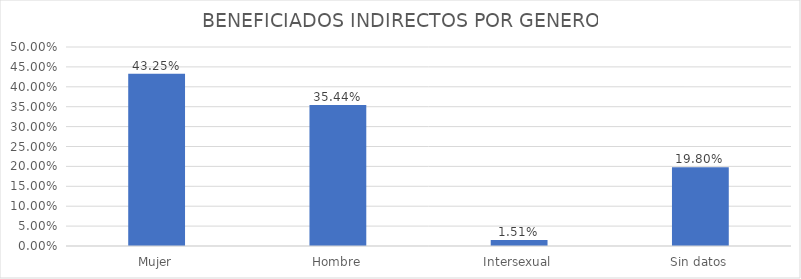
| Category | % |
|---|---|
| Mujer | 0.432 |
| Hombre | 0.354 |
| Intersexual | 0.015 |
| Sin datos | 0.198 |